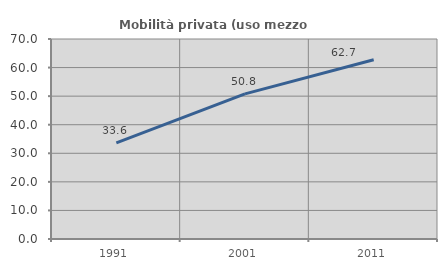
| Category | Mobilità privata (uso mezzo privato) |
|---|---|
| 1991.0 | 33.635 |
| 2001.0 | 50.781 |
| 2011.0 | 62.747 |